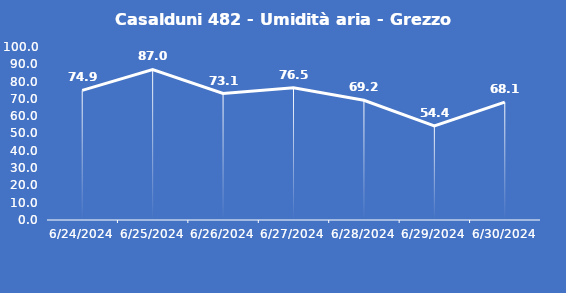
| Category | Casalduni 482 - Umidità aria - Grezzo (%) |
|---|---|
| 6/24/24 | 74.9 |
| 6/25/24 | 87 |
| 6/26/24 | 73.1 |
| 6/27/24 | 76.5 |
| 6/28/24 | 69.2 |
| 6/29/24 | 54.4 |
| 6/30/24 | 68.1 |